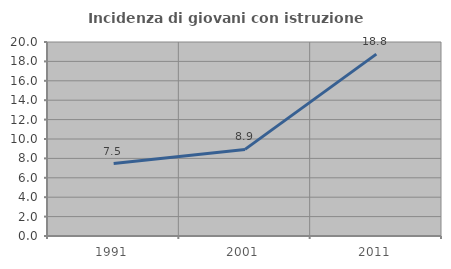
| Category | Incidenza di giovani con istruzione universitaria |
|---|---|
| 1991.0 | 7.463 |
| 2001.0 | 8.929 |
| 2011.0 | 18.75 |